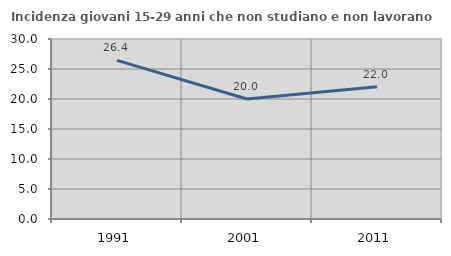
| Category | Incidenza giovani 15-29 anni che non studiano e non lavorano  |
|---|---|
| 1991.0 | 26.444 |
| 2001.0 | 20 |
| 2011.0 | 22.024 |